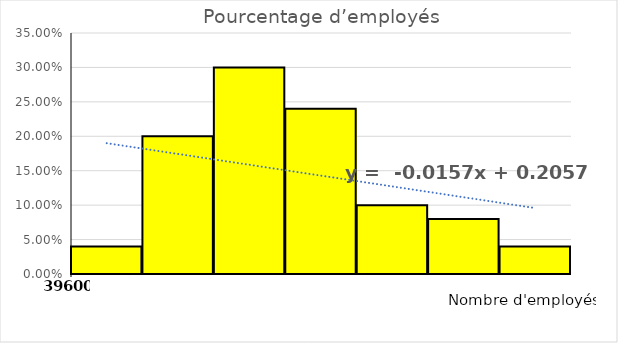
| Category | Pourcentage d’employés |
|---|---|
| [39600,46200[ | 0.04 |
| [46200,52800[ | 0.2 |
| [52800,459400[ | 0.3 |
| [59400,66000[ | 0.24 |
| [66000,72700[ | 0.1 |
| [72700,79200[ | 0.08 |
| [79200,85800[ | 0.04 |